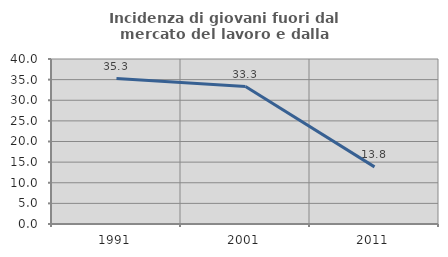
| Category | Incidenza di giovani fuori dal mercato del lavoro e dalla formazione  |
|---|---|
| 1991.0 | 35.252 |
| 2001.0 | 33.333 |
| 2011.0 | 13.846 |